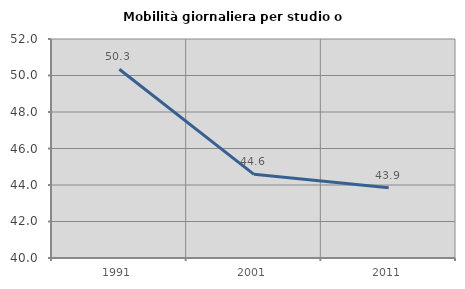
| Category | Mobilità giornaliera per studio o lavoro |
|---|---|
| 1991.0 | 50.342 |
| 2001.0 | 44.583 |
| 2011.0 | 43.853 |